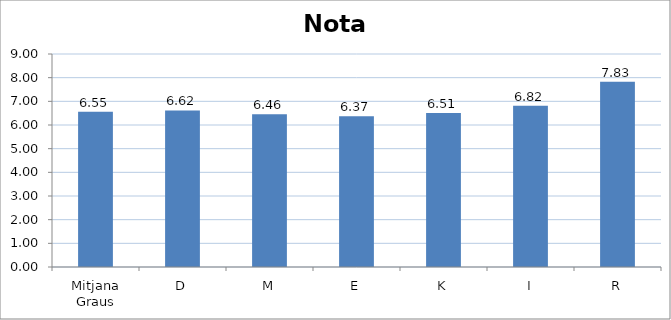
| Category | Nota Mitjana |
|---|---|
| Mitjana Graus | 6.555 |
| D | 6.618 |
| M | 6.458 |
| E | 6.374 |
| K | 6.507 |
| I | 6.816 |
| R | 7.83 |